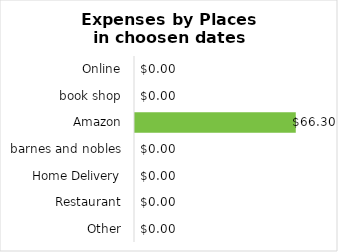
| Category | Expenses |
|---|---|
| Online | 0 |
| book shop | 0 |
| Amazon | 66.3 |
| barnes and nobles | 0 |
| Home Delivery | 0 |
| Restaurant | 0 |
| Other | 0 |